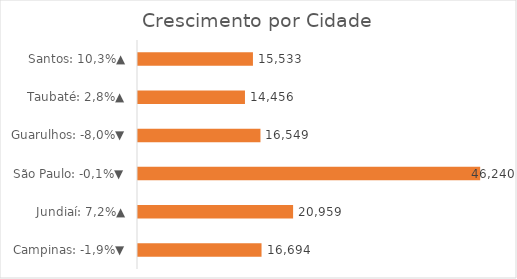
| Category | Series 0 |
|---|---|
| Campinas: -1,9%▼ | 16694317 |
| Jundiaí: 7,2%▲ | 20959439 |
| São Paulo: -0,1%▼ | 46240485 |
| Guarulhos: -8,0%▼ | 16549202 |
| Taubaté: 2,8%▲ | 14455546 |
| Santos: 10,3%▲ | 15533416 |